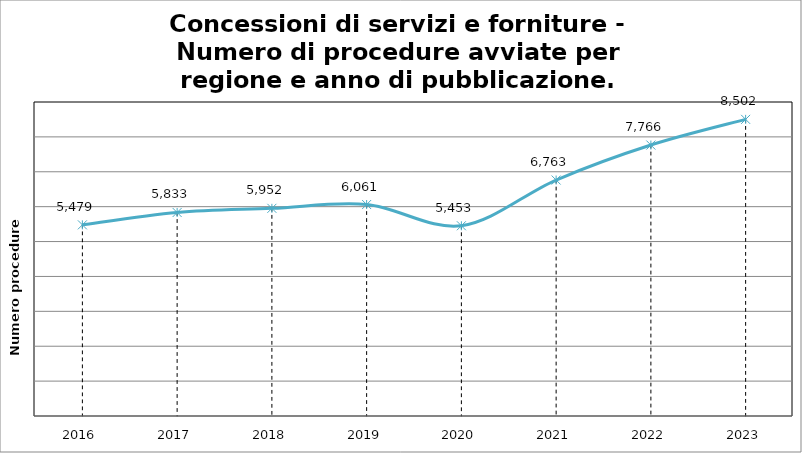
| Category | Totale |
|---|---|
| 2016.0 | 5479 |
| 2017.0 | 5833 |
| 2018.0 | 5952 |
| 2019.0 | 6061 |
| 2020.0 | 5453 |
| 2021.0 | 6763 |
| 2022.0 | 7766 |
| 2023.0 | 8502 |